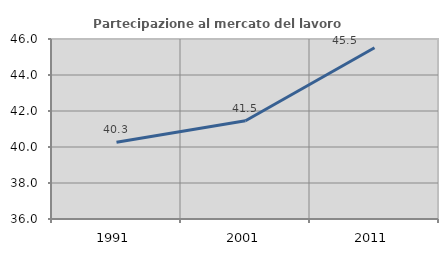
| Category | Partecipazione al mercato del lavoro  femminile |
|---|---|
| 1991.0 | 40.268 |
| 2001.0 | 41.457 |
| 2011.0 | 45.516 |